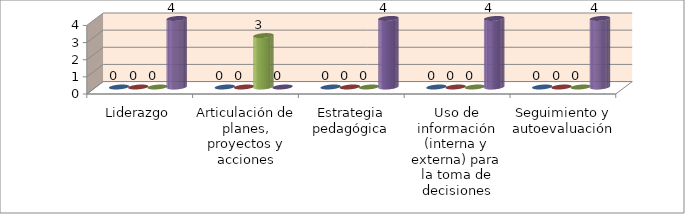
| Category | Series 0 | Series 1 | Series 2 | Series 3 |
|---|---|---|---|---|
| Liderazgo | 0 | 0 | 0 | 4 |
| Articulación de planes,
proyectos y acciones | 0 | 0 | 3 | 0 |
| Estrategia pedagógica | 0 | 0 | 0 | 4 |
| Uso de información (interna y externa) para la toma de
decisiones | 0 | 0 | 0 | 4 |
| Seguimiento y autoevaluación | 0 | 0 | 0 | 4 |